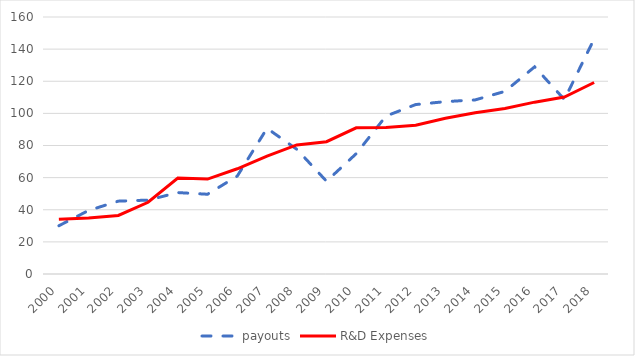
| Category | payouts | R&D Expenses |
|---|---|---|
| 2000.0 | 30.039 | 34.108 |
| 2001.0 | 39.553 | 34.873 |
| 2002.0 | 45.358 | 36.426 |
| 2003.0 | 46.004 | 44.661 |
| 2004.0 | 50.684 | 59.786 |
| 2005.0 | 49.649 | 59.106 |
| 2006.0 | 60.976 | 65.5 |
| 2007.0 | 90.684 | 73.4 |
| 2008.0 | 77.662 | 80.353 |
| 2009.0 | 57.753 | 82.365 |
| 2010.0 | 74.924 | 91.034 |
| 2011.0 | 98.317 | 91.282 |
| 2012.0 | 105.491 | 92.564 |
| 2013.0 | 107.324 | 96.916 |
| 2014.0 | 108.384 | 100.44 |
| 2015.0 | 113.698 | 103.004 |
| 2016.0 | 128.976 | 106.988 |
| 2017.0 | 108.627 | 110.141 |
| 2018.0 | 146.346 | 119.217 |